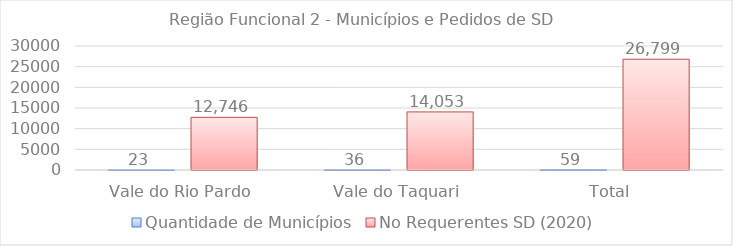
| Category | Quantidade de Municípios | No Requerentes SD (2020) |
|---|---|---|
| Vale do Rio Pardo | 23 | 12746 |
| Vale do Taquari | 36 | 14053 |
| Total  | 59 | 26799 |